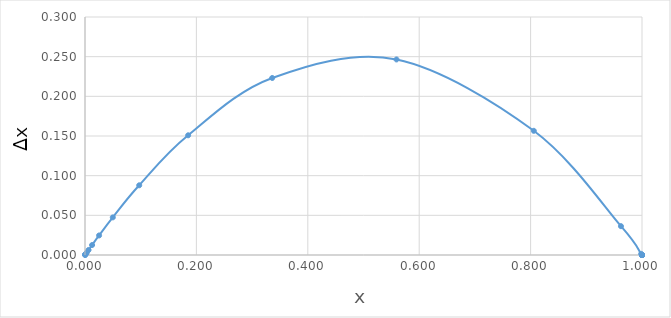
| Category | Δt |
|---|---|
| 0.0001 | 0 |
| 0.00019999000000000001 | 0 |
| 0.0003999400039999 | 0 |
| 0.0007997200559930006 | 0.001 |
| 0.0015988005598180435 | 0.002 |
| 0.0031950449564060127 | 0.003 |
| 0.00637988160053857 | 0.006 |
| 0.012719060311840249 | 0.013 |
| 0.02527634612846427 | 0.025 |
| 0.04991379858332261 | 0.047 |
| 0.09733620987762873 | 0.088 |
| 0.18519808200191568 | 0.151 |
| 0.3360978344266431 | 0.223 |
| 0.559233914547007 | 0.246 |
| 0.8057252579144448 | 0.157 |
| 0.9622573245875911 | 0.036 |
| 0.9985754904527135 | 0.001 |
| 0.9999979707725497 | 0 |
| 0.9999999999958822 | 0 |
| 1.0 | 0 |
| 1.0 | 0 |
| 1.0 | 0 |
| 1.0 | 0 |
| 1.0 | 0 |
| 1.0 | 0 |
| 1.0 | 0 |
| 1.0 | 0 |
| 1.0 | 0 |
| 1.0 | 0 |
| 1.0 | 0 |
| 1.0 | 0 |